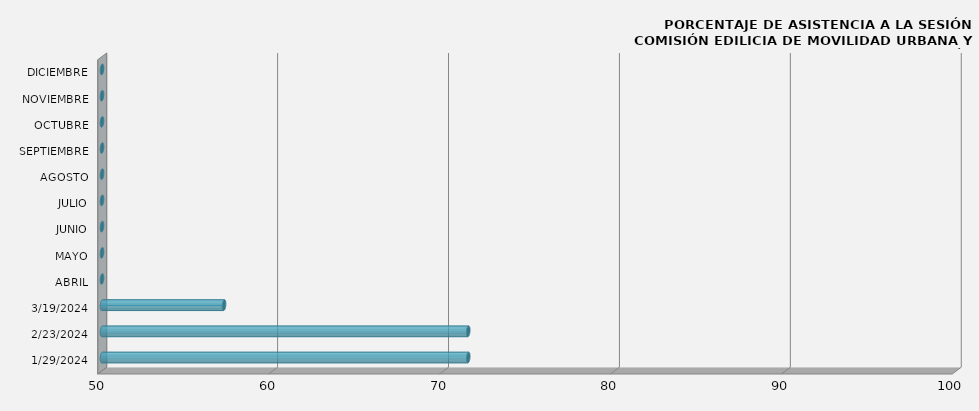
| Category | Series 0 |
|---|---|
| 29/01/2024 | 71.429 |
| 23/02/2024 | 71.429 |
| 19/03/2024 | 57.143 |
| ABRIL | 0 |
| MAYO | 0 |
| JUNIO | 0 |
| JULIO | 0 |
| AGOSTO | 0 |
| SEPTIEMBRE | 0 |
| OCTUBRE | 0 |
| NOVIEMBRE | 0 |
| DICIEMBRE | 0 |